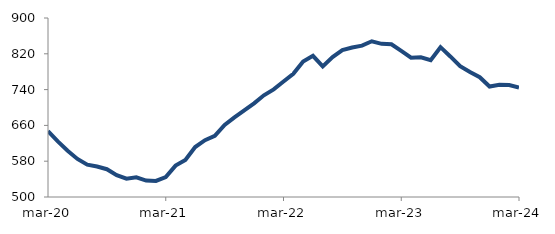
| Category | Series 0 |
|---|---|
| 2020-03-01 | 647.24 |
| 2020-04-01 | 624.208 |
| 2020-05-01 | 603.464 |
| 2020-06-01 | 585.1 |
| 2020-07-01 | 572.204 |
| 2020-08-01 | 568.185 |
| 2020-09-01 | 562.085 |
| 2020-10-01 | 548.898 |
| 2020-11-01 | 541.013 |
| 2020-12-01 | 544.038 |
| 2021-01-01 | 536.772 |
| 2021-02-01 | 535.938 |
| 2021-03-01 | 544.717 |
| 2021-04-01 | 570.16 |
| 2021-05-01 | 582.981 |
| 2021-06-01 | 611.684 |
| 2021-07-01 | 627.037 |
| 2021-08-01 | 636.642 |
| 2021-09-01 | 661.114 |
| 2021-10-01 | 677.889 |
| 2021-11-01 | 693.389 |
| 2021-12-01 | 709.343 |
| 2022-01-01 | 727.31 |
| 2022-02-01 | 740.539 |
| 2022-03-01 | 758.027 |
| 2022-04-01 | 775.241 |
| 2022-05-01 | 802.956 |
| 2022-06-01 | 815.434 |
| 2022-07-01 | 791.89 |
| 2022-08-01 | 812.76 |
| 2022-09-01 | 828.12 |
| 2022-10-01 | 834 |
| 2022-11-01 | 838.178 |
| 2022-12-01 | 847.954 |
| 2023-01-01 | 842.285 |
| 2023-02-01 | 841.25 |
| 2023-03-01 | 826.38 |
| 2023-04-01 | 811.394 |
| 2023-05-01 | 812.228 |
| 2023-06-01 | 805.926 |
| 2023-07-01 | 834.815 |
| 2023-08-01 | 814.103 |
| 2023-09-01 | 792.442 |
| 2023-10-01 | 779.206 |
| 2023-11-01 | 767.605 |
| 2023-12-01 | 746.855 |
| 2024-01-01 | 750.731 |
| 2024-02-01 | 750.251 |
| 2024-03-01 | 744.465 |